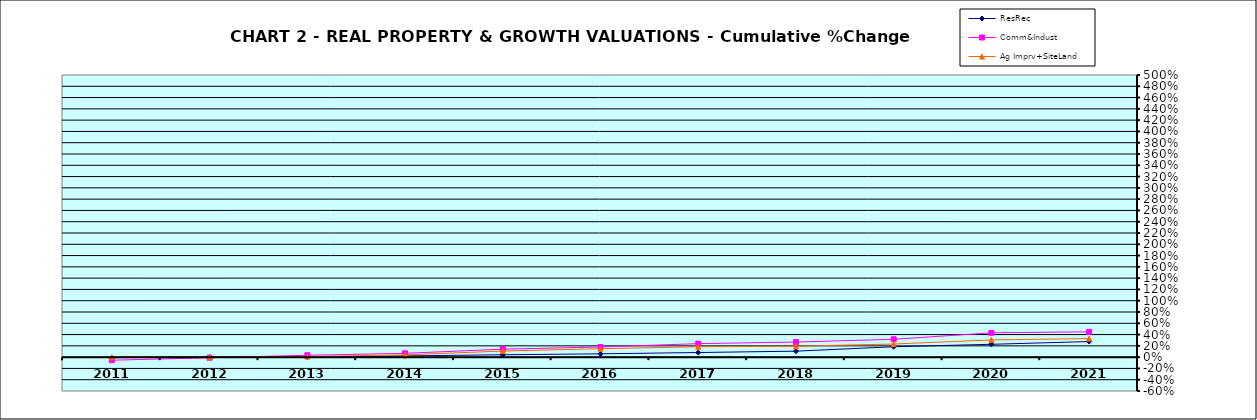
| Category | ResRec | Comm&Indust | Ag Imprv+SiteLand |
|---|---|---|---|
| 2011.0 | -0.01 | -0.054 | 0 |
| 2012.0 | 0.002 | -0.011 | -0.001 |
| 2013.0 | 0 | 0.033 | 0.01 |
| 2014.0 | 0.022 | 0.068 | 0.04 |
| 2015.0 | 0.042 | 0.141 | 0.109 |
| 2016.0 | 0.059 | 0.18 | 0.149 |
| 2017.0 | 0.082 | 0.239 | 0.184 |
| 2018.0 | 0.106 | 0.267 | 0.194 |
| 2019.0 | 0.184 | 0.317 | 0.232 |
| 2020.0 | 0.228 | 0.431 | 0.305 |
| 2021.0 | 0.276 | 0.449 | 0.329 |